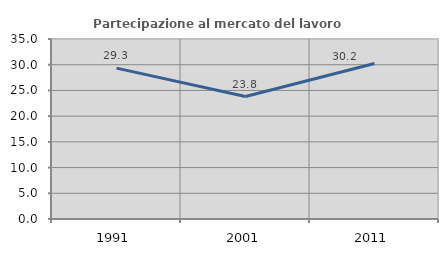
| Category | Partecipazione al mercato del lavoro  femminile |
|---|---|
| 1991.0 | 29.339 |
| 2001.0 | 23.817 |
| 2011.0 | 30.229 |